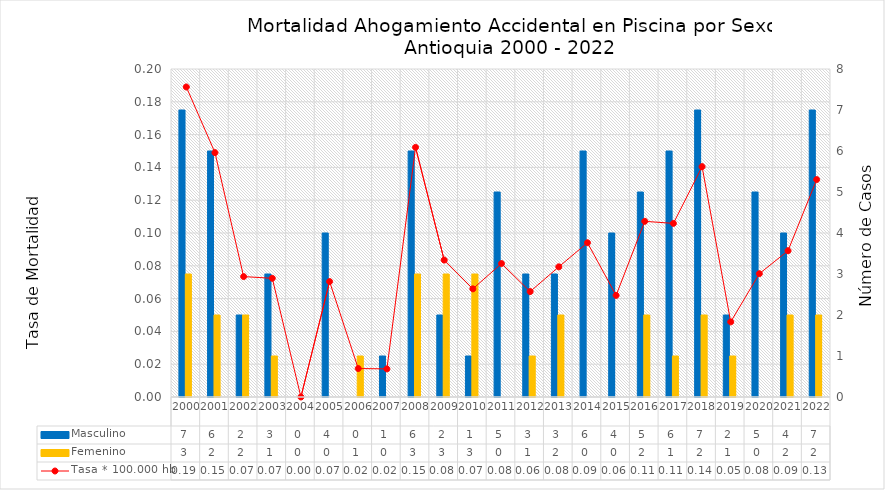
| Category | Masculino | Femenino |
|---|---|---|
| 0 | 7 | 3 |
| 1 | 6 | 2 |
| 2 | 2 | 2 |
| 3 | 3 | 1 |
| 4 | 0 | 0 |
| 5 | 4 | 0 |
| 6 | 0 | 1 |
| 7 | 1 | 0 |
| 8 | 6 | 3 |
| 9 | 2 | 3 |
| 10 | 1 | 3 |
| 11 | 5 | 0 |
| 12 | 3 | 1 |
| 13 | 3 | 2 |
| 14 | 6 | 0 |
| 15 | 4 | 0 |
| 16 | 5 | 2 |
| 17 | 6 | 1 |
| 18 | 7 | 2 |
| 19 | 2 | 1 |
| 20 | 5 | 0 |
| 21 | 4 | 2 |
| 22 | 7 | 2 |